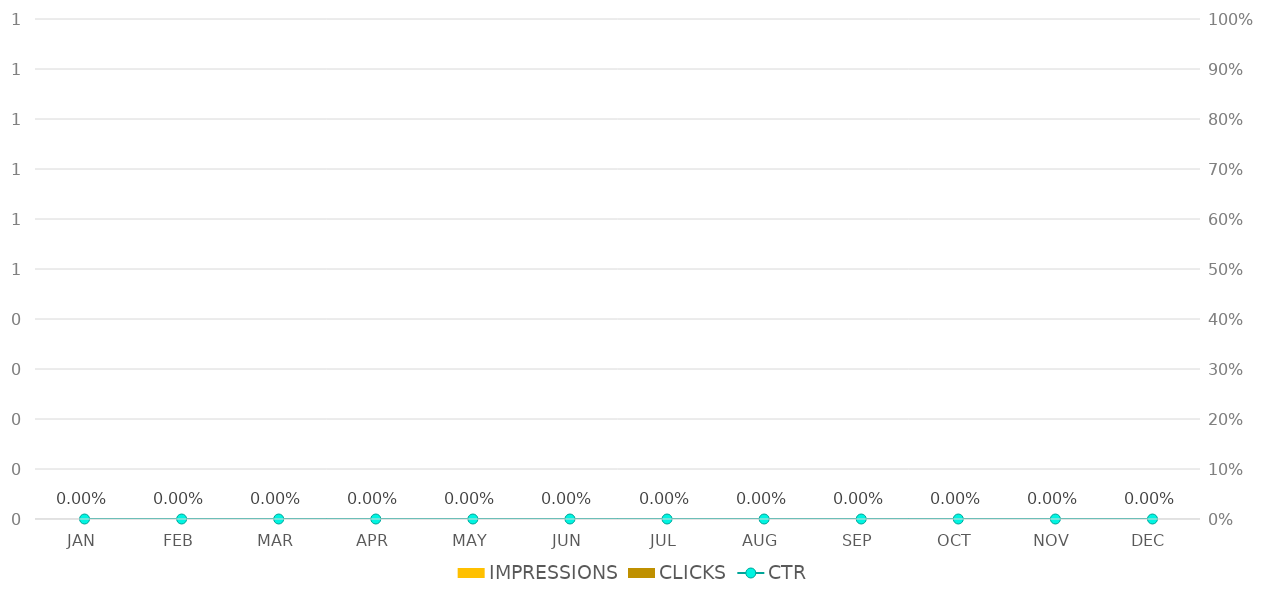
| Category | IMPRESSIONS | CLICKS |
|---|---|---|
| JAN | 0 | 0 |
| FEB | 0 | 0 |
| MAR | 0 | 0 |
| APR | 0 | 0 |
| MAY | 0 | 0 |
| JUN | 0 | 0 |
| JUL | 0 | 0 |
| AUG | 0 | 0 |
| SEP | 0 | 0 |
| OCT | 0 | 0 |
| NOV | 0 | 0 |
| DEC | 0 | 0 |